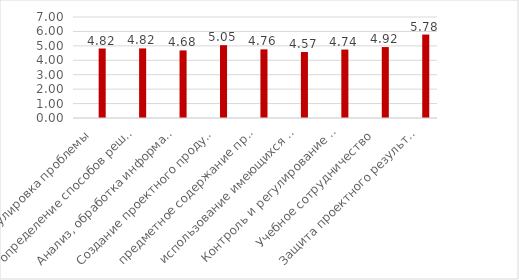
| Category | Series 0 | Series 1 | Series 2 |
|---|---|---|---|
| Формулировка проблемы |  |  | 4.817 |
| определение способов решения проблемы  |  |  | 4.823 |
| Анализ, обработка информации |  |  | 4.683 |
| Создание проектного продукта |  |  | 5.047 |
| предметное содержание проекта  |  |  | 4.757 |
| использование имеющихся способов |  |  | 4.573 |
| Контроль и регулирование проектной де |  |  | 4.743 |
| Учебное сотрудничество |  |  | 4.917 |
| Защита проектного результата |  |  | 5.783 |